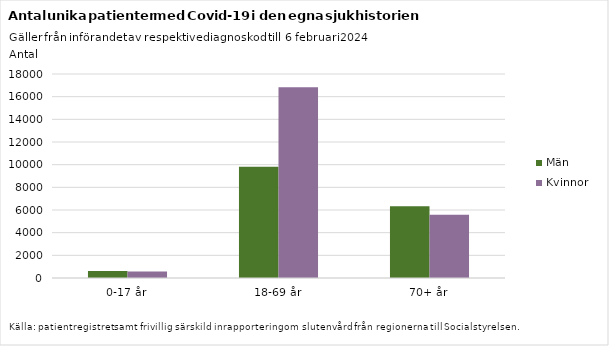
| Category | Män | Kvinnor |
|---|---|---|
| 0-17 år | 625 | 574 |
| 18-69 år | 9824 | 16834 |
| 70+ år | 6327 | 5589 |